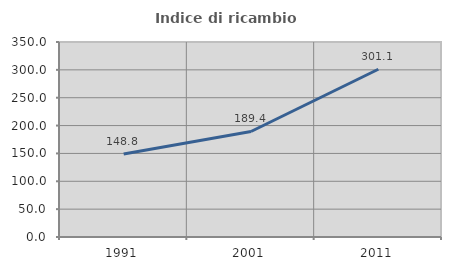
| Category | Indice di ricambio occupazionale  |
|---|---|
| 1991.0 | 148.802 |
| 2001.0 | 189.397 |
| 2011.0 | 301.116 |